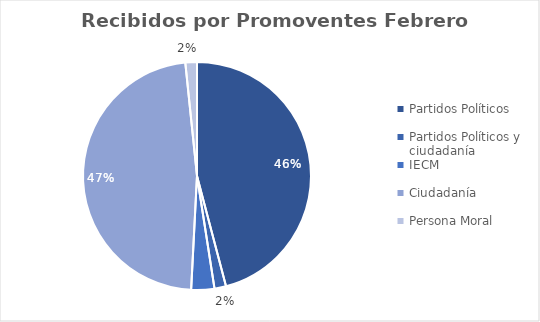
| Category | Series 0 |
|---|---|
| Partidos Políticos | 28 |
| Partidos Políticos y ciudadanía | 1 |
| IECM | 2 |
| Ciudadanía  | 29 |
| Persona Moral | 1 |